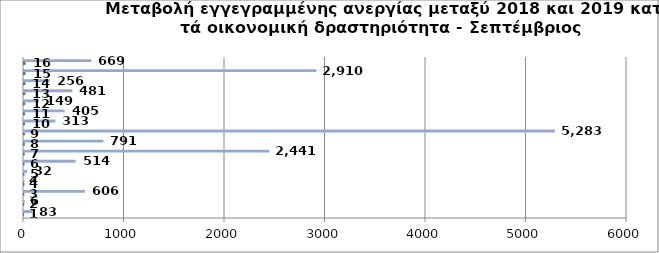
| Category | Series 0 | Series 1 |
|---|---|---|
| 0 | 1 | 83 |
| 1 | 2 | 6 |
| 2 | 3 | 606 |
| 3 | 4 | 4 |
| 4 | 5 | 32 |
| 5 | 6 | 514 |
| 6 | 7 | 2441 |
| 7 | 8 | 791 |
| 8 | 9 | 5283 |
| 9 | 10 | 313 |
| 10 | 11 | 405 |
| 11 | 12 | 149 |
| 12 | 13 | 481 |
| 13 | 14 | 256 |
| 14 | 15 | 2910 |
| 15 | 16 | 669 |